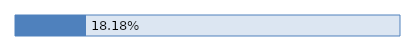
| Category | Series 0 |
|---|---|
| 0 | 0.182 |